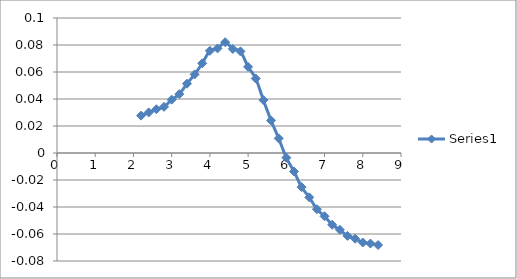
| Category | Series 0 |
|---|---|
| 2.2 | 0.028 |
| 2.4 | 0.03 |
| 2.6 | 0.032 |
| 2.8 | 0.034 |
| 3.0 | 0.04 |
| 3.2 | 0.044 |
| 3.4 | 0.051 |
| 3.6 | 0.058 |
| 3.8 | 0.066 |
| 4.0 | 0.076 |
| 4.2 | 0.077 |
| 4.4 | 0.082 |
| 4.6 | 0.077 |
| 4.8 | 0.075 |
| 5.0 | 0.064 |
| 5.2 | 0.055 |
| 5.4 | 0.039 |
| 5.6 | 0.024 |
| 5.8 | 0.011 |
| 5.99999999999999 | -0.003 |
| 6.19999999999999 | -0.014 |
| 6.39999999999999 | -0.025 |
| 6.59999999999999 | -0.033 |
| 6.79999999999999 | -0.042 |
| 6.99999999999999 | -0.047 |
| 7.19999999999999 | -0.053 |
| 7.39999999999999 | -0.057 |
| 7.59999999999999 | -0.061 |
| 7.79999999999999 | -0.063 |
| 7.99999999999999 | -0.066 |
| 8.19999999999999 | -0.067 |
| 8.39999999999999 | -0.068 |